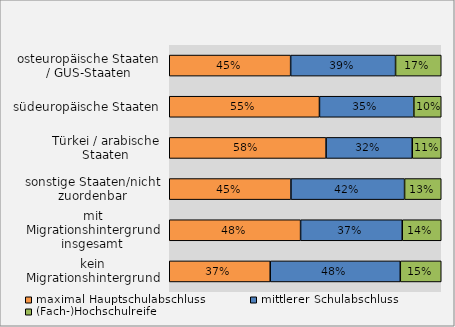
| Category | maximal Hauptschulabschluss | mittlerer Schulabschluss | (Fach-)Hochschulreife |
|---|---|---|---|
| kein Migrationshintergrund | 0.371 | 0.478 | 0.151 |
| mit Migrationshintergrund insgesamt | 0.483 | 0.374 | 0.143 |
| sonstige Staaten/nicht zuordenbar | 0.447 | 0.418 | 0.135 |
| Türkei / arabische Staaten | 0.577 | 0.317 | 0.107 |
| südeuropäische Staaten | 0.552 | 0.347 | 0.101 |
| osteuropäische Staaten / GUS-Staaten | 0.446 | 0.386 | 0.168 |